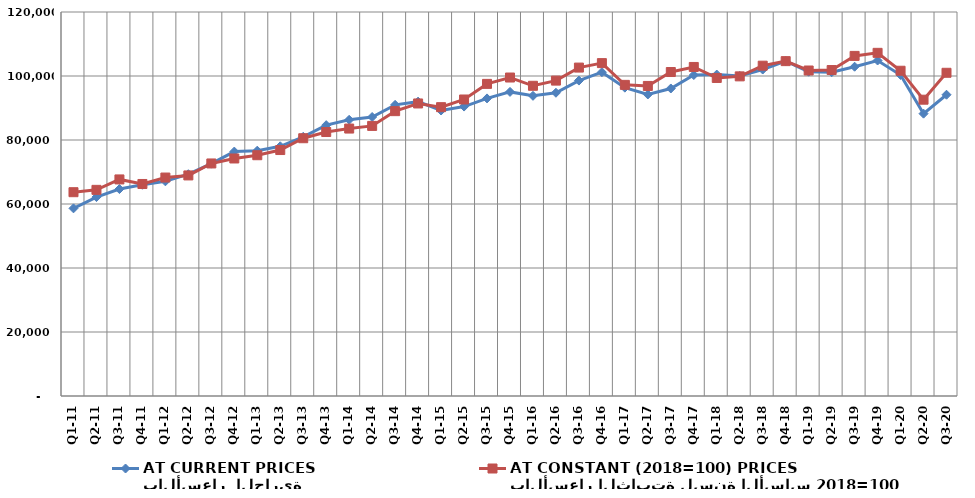
| Category | بالأسعار  الجارية
AT CURRENT PRICES | بالأسعار الثابتة لسنة الأساس 2018=100
AT CONSTANT (2018=100) PRICES |
|---|---|---|
| Q1-11 | 58639.011 | 63688.604 |
| Q2-11 | 62155.229 | 64419.436 |
| Q3-11 | 64667.888 | 67676.767 |
| Q4-11 | 66012.84 | 66256.933 |
| Q1-12 | 67081.337 | 68268.355 |
| Q2-12 | 69309.103 | 68929.324 |
| Q3-12 | 72604.594 | 72668.251 |
| Q4-12 | 76382.012 | 74224.95 |
| Q1-13 | 76659.798 | 75244.093 |
| Q2-13 | 78033.447 | 76862.407 |
| Q3-13 | 81008.301 | 80553.324 |
| Q4-13 | 84636.542 | 82494.238 |
| Q1-14 | 86312.629 | 83575.45 |
| Q2-14 | 87187.125 | 84401.327 |
| Q3-14 | 90982.033 | 89014.195 |
| Q4-14 | 91986.042 | 91417.367 |
| Q1-15 | 89218.257 | 90261.278 |
| Q2-15 | 90447.834 | 92659.138 |
| Q3-15 | 92994.679 | 97535.466 |
| Q4-15 | 95031.334 | 99526.196 |
| Q1-16 | 93804.661 | 96941.69 |
| Q2-16 | 94761.924 | 98563.001 |
| Q3-16 | 98570.536 | 102630.836 |
| Q4-16 | 101184.473 | 104024.545 |
| Q1-17 | 96364.032 | 97228.361 |
| Q2-17 | 94231.125 | 96891.689 |
| Q3-17 | 96099.127 | 101241.583 |
| Q4-17 | 100301.33 | 102823.511 |
| Q1-18 | 100451.377 | 99386.58 |
| Q2-18 | 100003.844 | 99886.008 |
| Q3-18 | 102019.033 | 103223.619 |
| Q4-18 | 104667.304 | 104645.351 |
| Q1-19 | 101338.658 | 101717.416 |
| Q2-19 | 101165.651 | 101863.044 |
| Q3-19 | 102900.85 | 106279.847 |
| Q4-19 | 104840.877 | 107241.02 |
| Q1-20 | 100325.459 | 101644.51 |
| Q2-20 | 88229.495 | 92595.325 |
| Q3-20 | 94145.407 | 101005.49 |